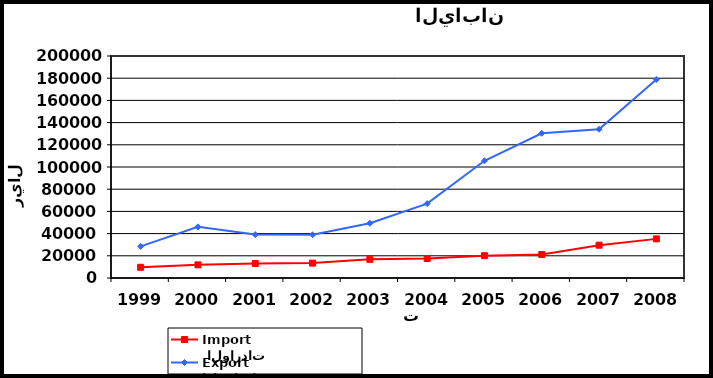
| Category |  الواردات           Import | الصادرات          Export |
|---|---|---|
| 1999.0 | 9650 | 28496 |
| 2000.0 | 11837 | 46074 |
| 2001.0 | 13042 | 39099 |
| 2002.0 | 13405 | 38974 |
| 2003.0 | 16797 | 49325 |
| 2004.0 | 17555 | 67006 |
| 2005.0 | 20093 | 105580 |
| 2006.0 | 21146 | 130369 |
| 2007.0 | 29563 | 134007 |
| 2008.0 | 35251 | 178823 |